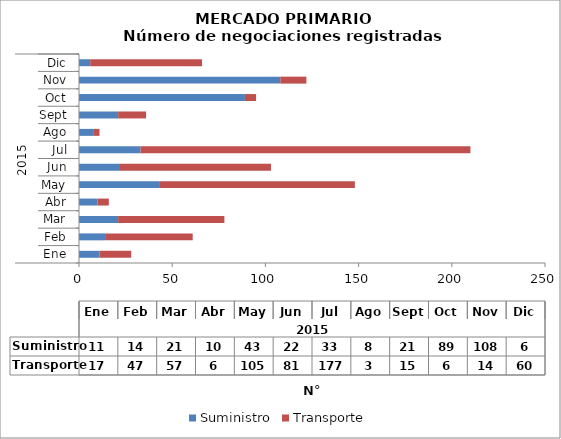
| Category | Suministro | Transporte |
|---|---|---|
| 0 | 11 | 17 |
| 1 | 14 | 47 |
| 2 | 21 | 57 |
| 3 | 10 | 6 |
| 4 | 43 | 105 |
| 5 | 22 | 81 |
| 6 | 33 | 177 |
| 7 | 8 | 3 |
| 8 | 21 | 15 |
| 9 | 89 | 6 |
| 10 | 108 | 14 |
| 11 | 6 | 60 |